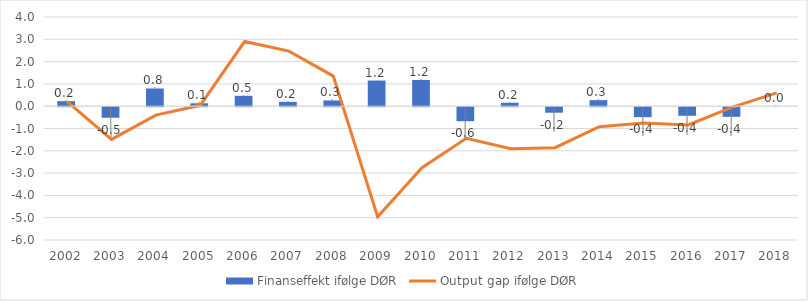
| Category | Finanseffekt ifølge DØR |
|---|---|
| 2002.0 | 0.227 |
| 2003.0 | -0.473 |
| 2004.0 | 0.794 |
| 2005.0 | 0.131 |
| 2006.0 | 0.466 |
| 2007.0 | 0.192 |
| 2008.0 | 0.258 |
| 2009.0 | 1.15 |
| 2010.0 | 1.174 |
| 2011.0 | -0.629 |
| 2012.0 | 0.155 |
| 2013.0 | -0.247 |
| 2014.0 | 0.271 |
| 2015.0 | -0.448 |
| 2016.0 | -0.385 |
| 2017.0 | -0.431 |
| 2018.0 | 0 |